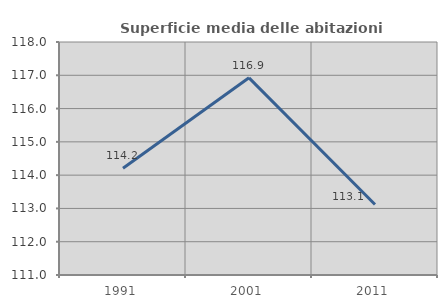
| Category | Superficie media delle abitazioni occupate |
|---|---|
| 1991.0 | 114.207 |
| 2001.0 | 116.924 |
| 2011.0 | 113.119 |